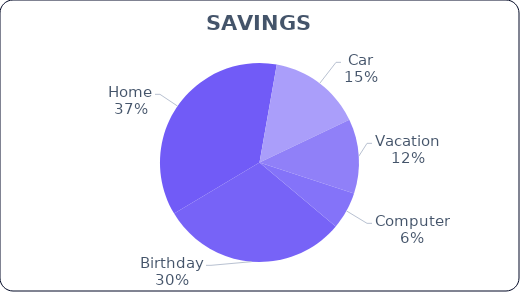
| Category | Actual |
|---|---|
| Birthday | 100 |
| Home | 120 |
| Car | 50 |
| Vacation | 40 |
| Computer | 20 |